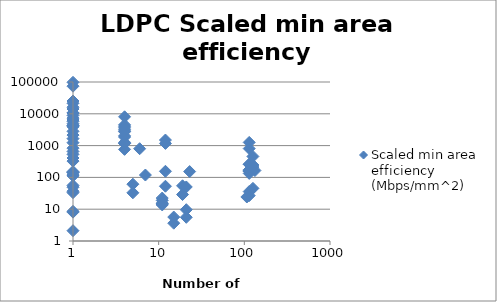
| Category | Scaled min area efficiency (Mbps/mm^2) |
|---|---|
| 107.0 | 24.233 |
| 114.0 | 1259.406 |
| 19.0 | 28.951 |
| 133.0 | 164.648 |
| 114.0 | 26.768 |
| 7.0 | 118.804 |
| 12.0 | 1169.73 |
| 114.0 | 163.636 |
| 114.0 | 35.901 |
| 11.0 | 15.54 |
| 11.0 | 14.674 |
| 11.0 | 22.428 |
| 21.0 | 9.633 |
| 11.0 | 18.974 |
| 11.0 | 13.605 |
| 5.0 | 61.121 |
| 21.0 | 5.56 |
| 15.0 | 5.67 |
| 15.0 | 3.629 |
| 21.0 | 50.049 |
| 11.0 | 14.568 |
| 5.0 | 32.82 |
| 1.0 | 55.794 |
| 12.0 | 52.786 |
| 1.0 | 2142.857 |
| 114.0 | 260.644 |
| 126.0 | 211.608 |
| 126.0 | 45.238 |
| 126.0 | 455.244 |
| 1.0 | 142.047 |
| 126.0 | 245.133 |
| 1.0 | 36.782 |
| 114.0 | 173.187 |
| 19.0 | 54.472 |
| 1.0 | 142.047 |
| 1.0 | 530.898 |
| 1.0 | 407.095 |
| 1.0 | 33.096 |
| 1.0 | 325.447 |
| 1.0 | 8.084 |
| 1.0 | 49.103 |
| 1.0 | 152.602 |
| 1.0 | 119.287 |
| 1.0 | 8.586 |
| 1.0 | 111.908 |
| 1.0 | 2.109 |
| 1.0 | 6387.713 |
| 1.0 | 3900.613 |
| 1.0 | 21457.671 |
| 1.0 | 97968.734 |
| 1.0 | 7317.855 |
| 1.0 | 10566.196 |
| 4.0 | 1160.39 |
| 4.0 | 2019.724 |
| 4.0 | 2859.118 |
| 4.0 | 3150.864 |
| 4.0 | 1258.772 |
| 4.0 | 761.281 |
| 1.0 | 25263.732 |
| 4.0 | 3615.107 |
| 1.0 | 10775.862 |
| 1.0 | 4184.1 |
| 114.0 | 133.519 |
| 12.0 | 1496.199 |
| 23.0 | 152.55 |
| 114.0 | 156.253 |
| 114.0 | 806.504 |
| 1.0 | 1234.405 |
| 1.0 | 1655.955 |
| 1.0 | 830 |
| 1.0 | 8912.096 |
| 1.0 | 5799.402 |
| 6.0 | 798 |
| 114.0 | 255.689 |
| 114.0 | 157.143 |
| 4.0 | 4499.49 |
| 4.0 | 8043.478 |
| 1.0 | 653.061 |
| 12.0 | 155.667 |
| 1.0 | 2812.5 |
| 4.0 | 1184.615 |
| 4.0 | 1855.769 |
| 4.0 | 2727.273 |
| 1.0 | 4265.152 |
| 1.0 | 4853.896 |
| 1.0 | 16130.876 |
| 1.0 | 14137.284 |
| 4.0 | 4078.289 |
| 1.0 | 73789.775 |